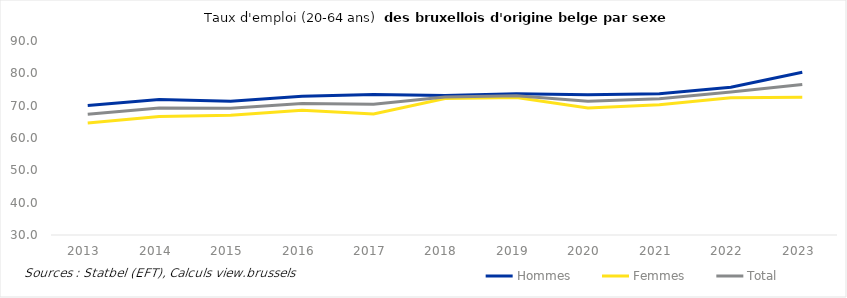
| Category | Hommes | Femmes | Total |
|---|---|---|---|
| 2013.0 | 70.078 | 64.634 | 67.351 |
| 2014.0 | 71.876 | 66.678 | 69.247 |
| 2015.0 | 71.393 | 67.025 | 69.209 |
| 2016.0 | 72.922 | 68.547 | 70.706 |
| 2017.0 | 73.438 | 67.414 | 70.472 |
| 2018.0 | 73.17 | 72.235 | 72.708 |
| 2019.0 | 73.664 | 72.505 | 73.097 |
| 2020.0 | 73.356 | 69.269 | 71.393 |
| 2021.0 | 73.653 | 70.297 | 72.108 |
| 2022.0 | 75.708 | 72.47 | 74.209 |
| 2023.0 | 80.307 | 72.616 | 76.58 |